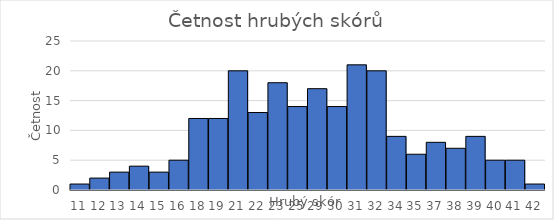
| Category | Series 0 |
|---|---|
| 11.0 | 1 |
| 12.0 | 2 |
| 13.0 | 3 |
| 14.0 | 4 |
| 15.0 | 3 |
| 16.0 | 5 |
| 18.0 | 12 |
| 19.0 | 12 |
| 21.0 | 20 |
| 22.0 | 13 |
| 23.0 | 18 |
| 25.0 | 14 |
| 29.0 | 17 |
| 30.0 | 14 |
| 31.0 | 21 |
| 32.0 | 20 |
| 34.0 | 9 |
| 35.0 | 6 |
| 37.0 | 8 |
| 38.0 | 7 |
| 39.0 | 9 |
| 40.0 | 5 |
| 41.0 | 5 |
| 42.0 | 1 |